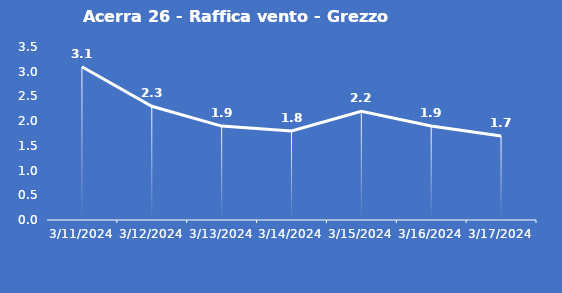
| Category | Acerra 26 - Raffica vento - Grezzo (m/s) |
|---|---|
| 3/11/24 | 3.1 |
| 3/12/24 | 2.3 |
| 3/13/24 | 1.9 |
| 3/14/24 | 1.8 |
| 3/15/24 | 2.2 |
| 3/16/24 | 1.9 |
| 3/17/24 | 1.7 |